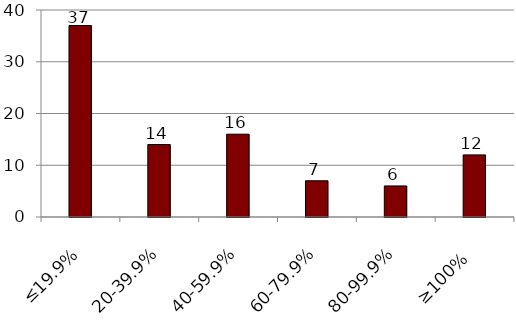
| Category | Series 0 |
|---|---|
| ≤19.9% | 37 |
| 20-39.9% | 14 |
| 40-59.9% | 16 |
| 60-79.9% | 7 |
| 80-99.9% | 6 |
| ≥100% | 12 |